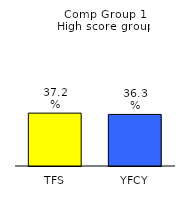
| Category | Series 0 |
|---|---|
| TFS | 0.372 |
| YFCY | 0.363 |